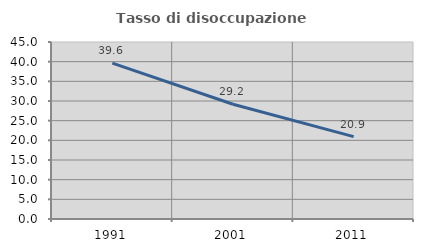
| Category | Tasso di disoccupazione giovanile  |
|---|---|
| 1991.0 | 39.64 |
| 2001.0 | 29.167 |
| 2011.0 | 20.93 |